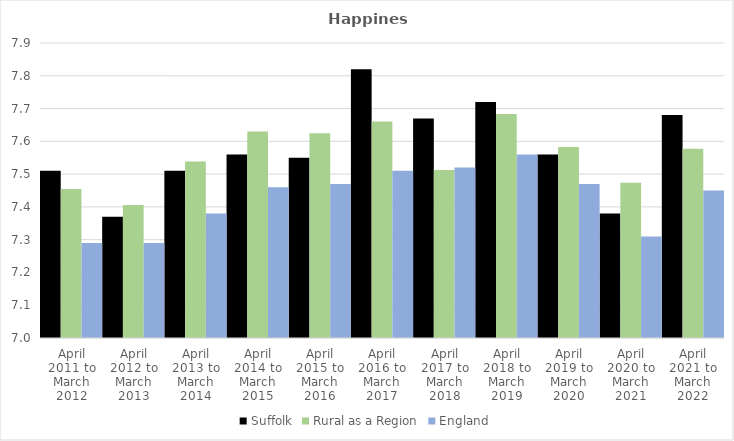
| Category | Suffolk | Rural as a Region | England |
|---|---|---|---|
| April 2011 to March 2012 | 7.51 | 7.454 | 7.29 |
| April 2012 to March 2013 | 7.37 | 7.406 | 7.29 |
| April 2013 to March 2014 | 7.51 | 7.539 | 7.38 |
| April 2014 to March 2015 | 7.56 | 7.63 | 7.46 |
| April 2015 to March 2016 | 7.55 | 7.625 | 7.47 |
| April 2016 to March 2017 | 7.82 | 7.661 | 7.51 |
| April 2017 to March 2018 | 7.67 | 7.513 | 7.52 |
| April 2018 to March 2019 | 7.72 | 7.684 | 7.56 |
| April 2019 to March 2020 | 7.56 | 7.582 | 7.47 |
| April 2020 to March 2021 | 7.38 | 7.474 | 7.31 |
| April 2021 to March 2022 | 7.68 | 7.577 | 7.45 |